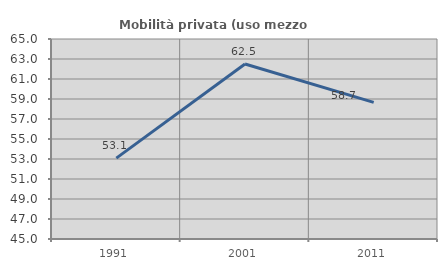
| Category | Mobilità privata (uso mezzo privato) |
|---|---|
| 1991.0 | 53.09 |
| 2001.0 | 62.5 |
| 2011.0 | 58.667 |